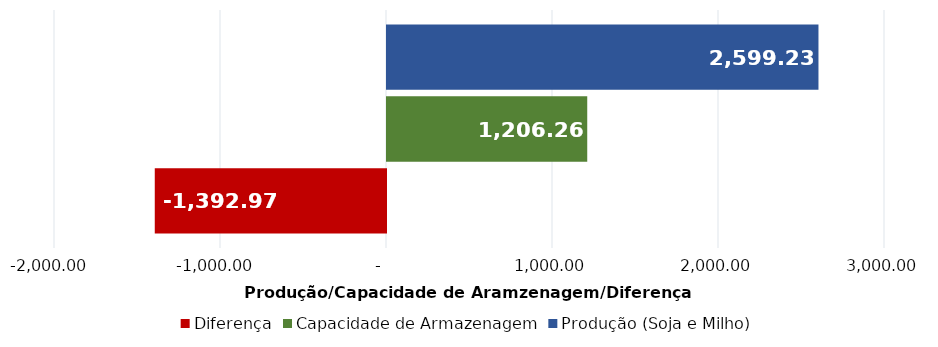
| Category | Diferença | Capacidade de Armazenagem | Produção (Soja e Milho) |
|---|---|---|---|
| 0 | -1392972 | 1206255 | 2599227 |